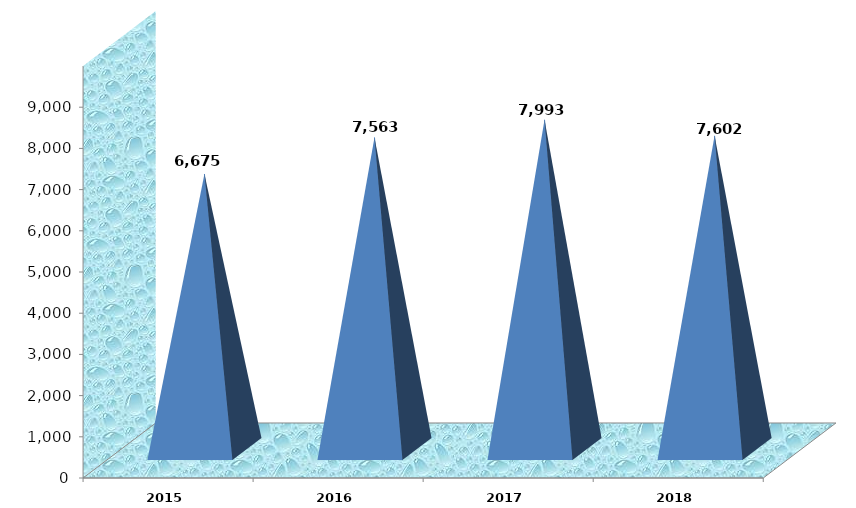
| Category | Series 0 |
|---|---|
| 2015 | 6675362 |
| 2016 | 7563283.233 |
| 2017 | 7992665.88 |
| 2018 | 7602173.67 |